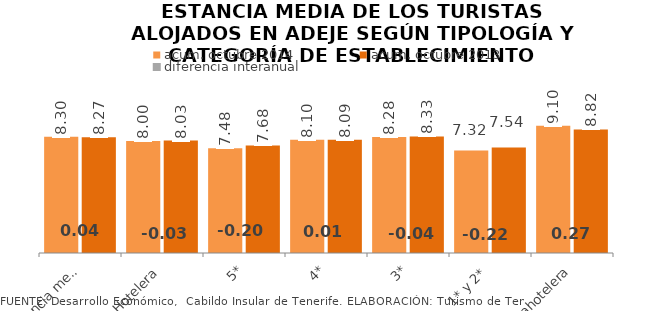
| Category | acum. octubre 2014 | acum. octubre 2013 |
|---|---|---|
| Estancia media total | 8.304 | 8.268 |
| Hotelera | 8.001 | 8.03 |
| 5* | 7.482 | 7.679 |
| 4* | 8.098 | 8.086 |
| 3* | 8.284 | 8.329 |
| 1* y 2* | 7.316 | 7.539 |
| Extrahotelera | 9.097 | 8.823 |